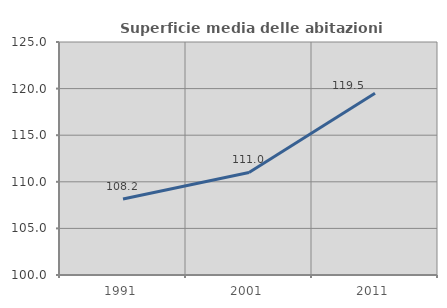
| Category | Superficie media delle abitazioni occupate |
|---|---|
| 1991.0 | 108.162 |
| 2001.0 | 110.999 |
| 2011.0 | 119.505 |